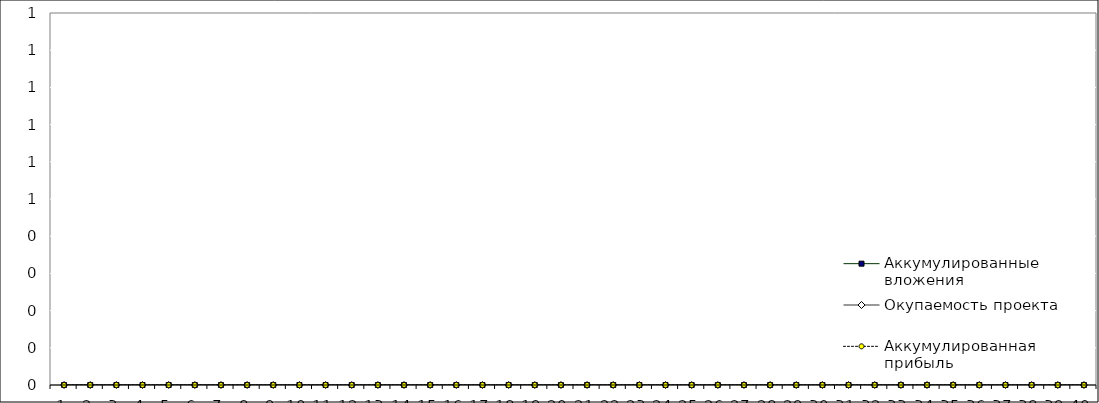
| Category | Аккумулированные вложения | Окупаемость проекта | Аккумулированная прибыль |
|---|---|---|---|
| 0 | 0 | 0 | 0 |
| 1 | 0 | 0 | 0 |
| 2 | 0 | 0 | 0 |
| 3 | 0 | 0 | 0 |
| 4 | 0 | 0 | 0 |
| 5 | 0 | 0 | 0 |
| 6 | 0 | 0 | 0 |
| 7 | 0 | 0 | 0 |
| 8 | 0 | 0 | 0 |
| 9 | 0 | 0 | 0 |
| 10 | 0 | 0 | 0 |
| 11 | 0 | 0 | 0 |
| 12 | 0 | 0 | 0 |
| 13 | 0 | 0 | 0 |
| 14 | 0 | 0 | 0 |
| 15 | 0 | 0 | 0 |
| 16 | 0 | 0 | 0 |
| 17 | 0 | 0 | 0 |
| 18 | 0 | 0 | 0 |
| 19 | 0 | 0 | 0 |
| 20 | 0 | 0 | 0 |
| 21 | 0 | 0 | 0 |
| 22 | 0 | 0 | 0 |
| 23 | 0 | 0 | 0 |
| 24 | 0 | 0 | 0 |
| 25 | 0 | 0 | 0 |
| 26 | 0 | 0 | 0 |
| 27 | 0 | 0 | 0 |
| 28 | 0 | 0 | 0 |
| 29 | 0 | 0 | 0 |
| 30 | 0 | 0 | 0 |
| 31 | 0 | 0 | 0 |
| 32 | 0 | 0 | 0 |
| 33 | 0 | 0 | 0 |
| 34 | 0 | 0 | 0 |
| 35 | 0 | 0 | 0 |
| 36 | 0 | 0 | 0 |
| 37 | 0 | 0 | 0 |
| 38 | 0 | 0 | 0 |
| 39 | 0 | 0 | 0 |